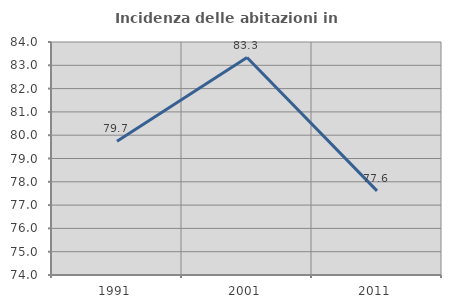
| Category | Incidenza delle abitazioni in proprietà  |
|---|---|
| 1991.0 | 79.74 |
| 2001.0 | 83.333 |
| 2011.0 | 77.609 |